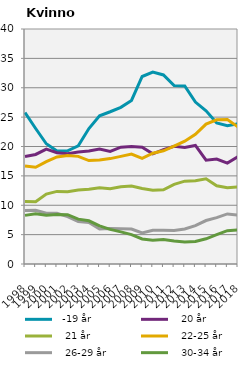
| Category |   -19 år |    20 år |    21 år |    22-25 år |    26-29 år |    30-34 år |
|---|---|---|---|---|---|---|
| 1998.0 | 25.773 | 18.308 | 10.619 | 16.691 | 9.107 | 8.277 |
| 1999.0 | 23.065 | 18.647 | 10.583 | 16.467 | 9.155 | 8.568 |
| 2000.0 | 20.462 | 19.546 | 11.909 | 17.424 | 8.636 | 8.318 |
| 2001.0 | 19.227 | 18.941 | 12.36 | 18.225 | 8.633 | 8.429 |
| 2002.0 | 19.267 | 18.788 | 12.316 | 18.448 | 8.055 | 8.389 |
| 2003.0 | 20.13 | 19.066 | 12.578 | 18.321 | 7.232 | 7.638 |
| 2004.0 | 23.055 | 19.228 | 12.728 | 17.602 | 7.059 | 7.352 |
| 2005.0 | 25.214 | 19.563 | 12.978 | 17.688 | 5.956 | 6.498 |
| 2006.0 | 25.916 | 19.168 | 12.8 | 17.94 | 6.027 | 5.885 |
| 2007.0 | 26.672 | 19.876 | 13.138 | 18.321 | 5.996 | 5.475 |
| 2008.0 | 27.845 | 20.02 | 13.257 | 18.72 | 5.959 | 4.993 |
| 2009.0 | 31.913 | 19.89 | 12.858 | 17.972 | 5.273 | 4.261 |
| 2010.0 | 32.66 | 18.752 | 12.569 | 18.849 | 5.725 | 4.036 |
| 2011.0 | 32.179 | 19.463 | 12.623 | 19.269 | 5.751 | 4.153 |
| 2012.0 | 30.364 | 20.037 | 13.554 | 20.049 | 5.719 | 3.902 |
| 2013.0 | 30.316 | 19.817 | 14.102 | 20.898 | 5.959 | 3.729 |
| 2014.0 | 27.556 | 20.171 | 14.177 | 22.069 | 6.523 | 3.818 |
| 2015.0 | 26.064 | 17.662 | 14.502 | 23.817 | 7.399 | 4.287 |
| 2016.0 | 24.007 | 17.87 | 13.327 | 24.551 | 7.897 | 4.986 |
| 2017.0 | 23.532 | 17.177 | 12.986 | 24.595 | 8.523 | 5.672 |
| 2018.0 | 23.875 | 18.292 | 13.122 | 23.322 | 8.325 | 5.813 |